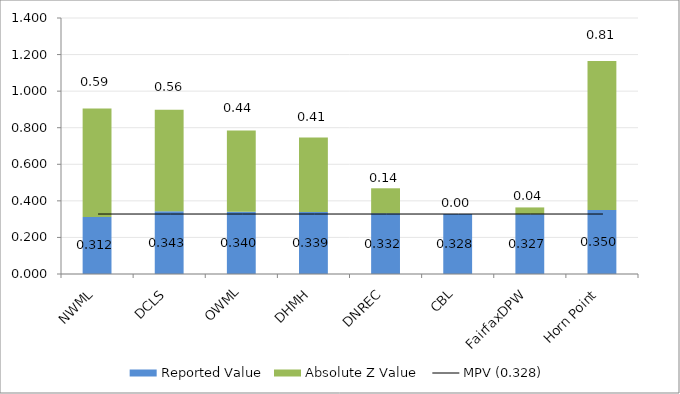
| Category | Reported Value | Absolute Z Value  |
|---|---|---|
| NWML | 0.312 | 0.593 |
| DCLS | 0.343 | 0.556 |
| OWML | 0.34 | 0.444 |
| DHMH | 0.339 | 0.407 |
| DNREC | 0.332 | 0.137 |
| CBL | 0.328 | 0 |
| FairfaxDPW | 0.327 | 0.037 |
| Horn Point | 0.35 | 0.815 |